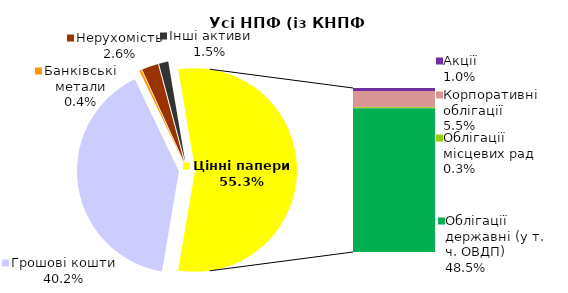
| Category | Усі НПФ (із КНПФ НБУ)* |
|---|---|
| Грошові кошти | 1666.39 |
| Банківські метали | 14.73 |
| Нерухомість | 108.949 |
| Інші активи | 61.381 |
| Акції | 41.964 |
| Корпоративні облігації | 227.286 |
| Облігації місцевих рад | 13.436 |
| Облігації державні (у т. ч. ОВДП) | 2012.06 |